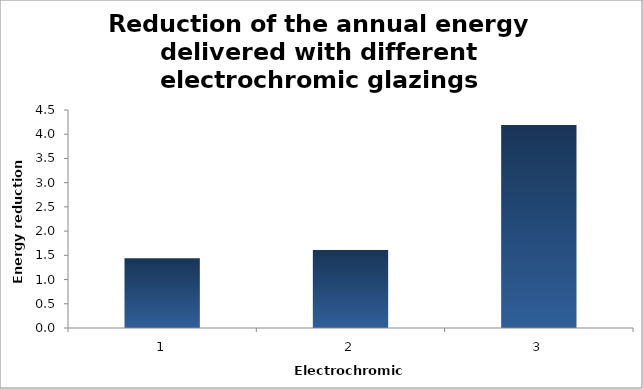
| Category | Series 0 |
|---|---|
| 0 | 1.438 |
| 1 | 1.611 |
| 2 | 4.192 |